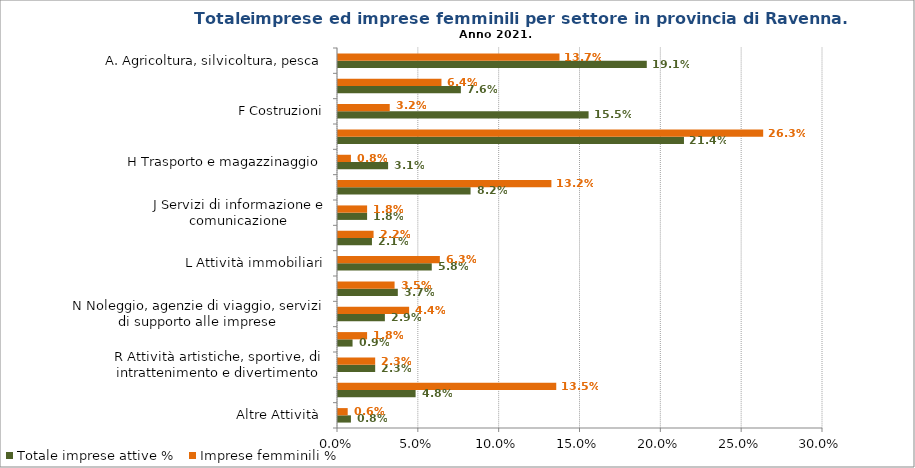
| Category | Totale imprese attive % | Imprese femminili % |
|---|---|---|
| Altre Attività  | 0.008 | 0.006 |
| S Altre attività di servizi | 0.048 | 0.135 |
| R Attività artistiche, sportive, di intrattenimento e divertimento | 0.023 | 0.023 |
| Q Sanità  ed assistenza sociale | 0.009 | 0.018 |
| N Noleggio, agenzie di viaggio, servizi di supporto alle imprese | 0.029 | 0.044 |
| M Attività professionali, scientifiche e tecniche | 0.037 | 0.035 |
| L Attività immobiliari | 0.058 | 0.063 |
| K Attività finanziarie e assicurative | 0.021 | 0.022 |
| J Servizi di informazione e comunicazione | 0.018 | 0.018 |
| I Attività dei servizi di alloggio e ristorazione | 0.082 | 0.132 |
| H Trasporto e magazzinaggio | 0.031 | 0.008 |
| G Commercio all'ingrosso ed al dettaglio; riparazione di automobili e motocicli | 0.214 | 0.263 |
| F Costruzioni | 0.155 | 0.032 |
| C Attività manifatturiere | 0.076 | 0.064 |
| A. Agricoltura, silvicoltura, pesca | 0.191 | 0.137 |